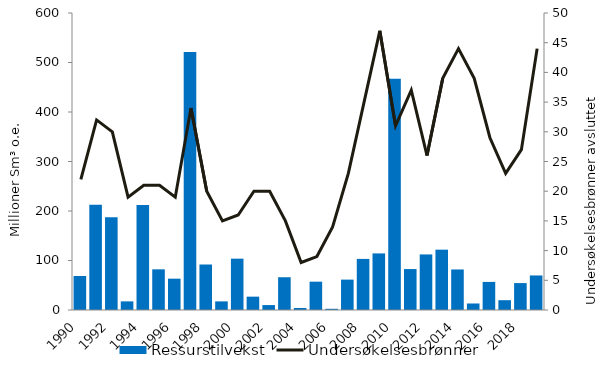
| Category | Ressurstilvekst |
|---|---|
| 1990.0 | 68.743 |
| 1991.0 | 212.682 |
| 1992.0 | 187.333 |
| 1993.0 | 17.43 |
| 1994.0 | 212.353 |
| 1995.0 | 82.151 |
| 1996.0 | 63.287 |
| 1997.0 | 521.34 |
| 1998.0 | 91.904 |
| 1999.0 | 17.404 |
| 2000.0 | 103.695 |
| 2001.0 | 26.947 |
| 2002.0 | 9.948 |
| 2003.0 | 66.174 |
| 2004.0 | 4.081 |
| 2005.0 | 57.22 |
| 2006.0 | 2.446 |
| 2007.0 | 61.389 |
| 2008.0 | 103.204 |
| 2009.0 | 114.324 |
| 2010.0 | 467.071 |
| 2011.0 | 82.712 |
| 2012.0 | 112.275 |
| 2013.0 | 121.889 |
| 2014.0 | 81.863 |
| 2015.0 | 13.145 |
| 2016.0 | 56.764 |
| 2017.0 | 19.807 |
| 2018.0 | 54.378 |
| 2019.0 | 69.791 |